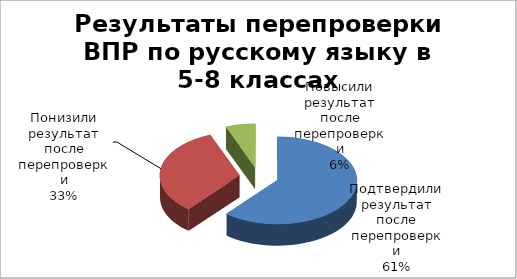
| Category | Series 0 |
|---|---|
| Подтвердили результат после перепроверки | 0.61 |
| Понизили результат после перепроверки | 0.33 |
| Повысили результат после перепроверки | 0.06 |